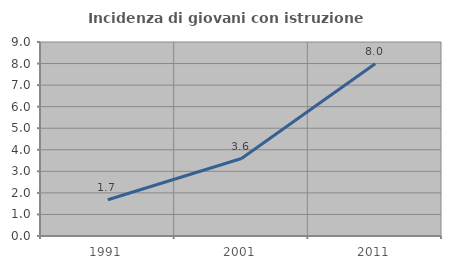
| Category | Incidenza di giovani con istruzione universitaria |
|---|---|
| 1991.0 | 1.684 |
| 2001.0 | 3.593 |
| 2011.0 | 7.99 |